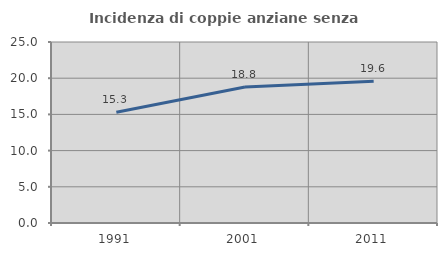
| Category | Incidenza di coppie anziane senza figli  |
|---|---|
| 1991.0 | 15.302 |
| 2001.0 | 18.794 |
| 2011.0 | 19.565 |